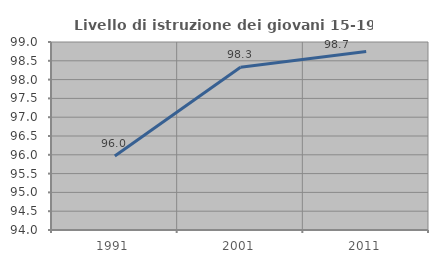
| Category | Livello di istruzione dei giovani 15-19 anni |
|---|---|
| 1991.0 | 95.969 |
| 2001.0 | 98.33 |
| 2011.0 | 98.748 |